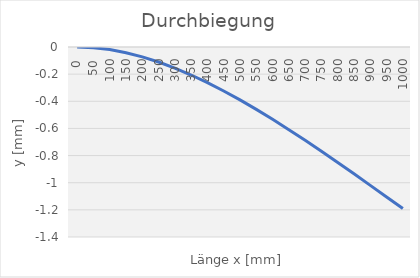
| Category | Series 0 |
|---|---|
| 0.0 | 0 |
| 50.0 | -0.005 |
| 100.0 | -0.019 |
| 150.0 | -0.042 |
| 200.0 | -0.073 |
| 250.0 | -0.111 |
| 300.0 | -0.155 |
| 350.0 | -0.206 |
| 400.0 | -0.263 |
| 450.0 | -0.324 |
| 500.0 | -0.39 |
| 550.0 | -0.46 |
| 600.0 | -0.533 |
| 650.0 | -0.609 |
| 700.0 | -0.688 |
| 750.0 | -0.768 |
| 800.0 | -0.851 |
| 850.0 | -0.935 |
| 900.0 | -1.019 |
| 950.0 | -1.105 |
| 1000.0 | -1.19 |